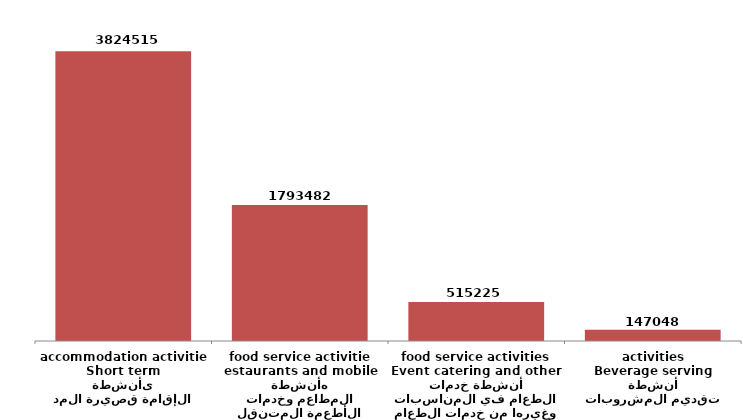
| Category | Series 0 |
|---|---|
| أنشطة الإقامة قصيرة المدى
Short term accommodation activities | 3824515 |
| أنشطة المطاعم وخدمات الأطعمة المتنقله
estaurants and mobile food service activities | 1793482 |
| أنشطة خدمات الطعام في المناسبات وغيرها من خدمات الطعام
Event catering and other food service activities | 515225 |
| أنشطة تقديم المشروبات
Beverage serving activities | 147048 |